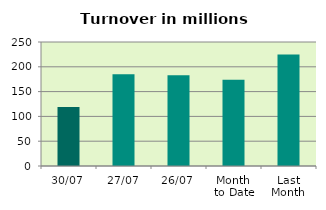
| Category | Series 0 |
|---|---|
| 30/07 | 118.904 |
| 27/07 | 184.971 |
| 26/07 | 182.842 |
| Month 
to Date | 173.78 |
| Last
Month | 224.832 |